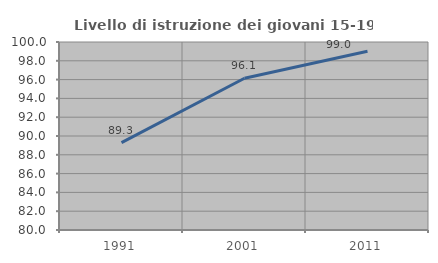
| Category | Livello di istruzione dei giovani 15-19 anni |
|---|---|
| 1991.0 | 89.295 |
| 2001.0 | 96.139 |
| 2011.0 | 99.015 |